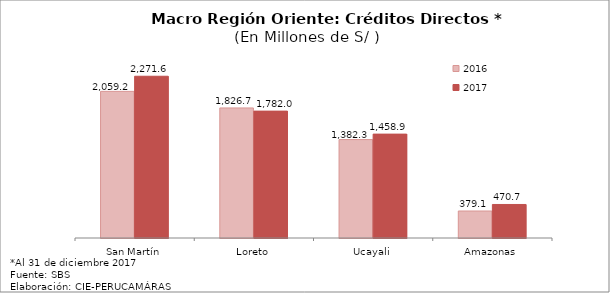
| Category | 2016 | 2017 |
|---|---|---|
| San Martín | 2059.224 | 2271.612 |
| Loreto | 1826.656 | 1782.004 |
| Ucayali | 1382.259 | 1458.923 |
| Amazonas | 379.135 | 470.732 |